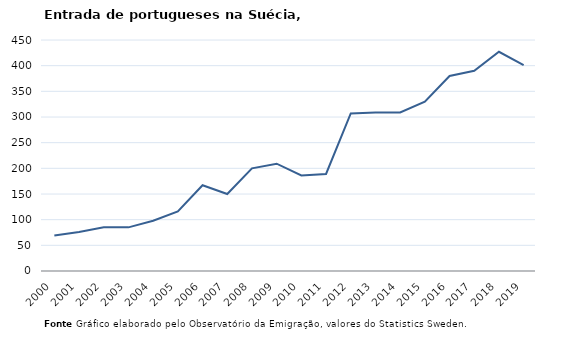
| Category | Entradas |
|---|---|
| 2000.0 | 69 |
| 2001.0 | 76 |
| 2002.0 | 85 |
| 2003.0 | 85 |
| 2004.0 | 98 |
| 2005.0 | 116 |
| 2006.0 | 167 |
| 2007.0 | 150 |
| 2008.0 | 200 |
| 2009.0 | 209 |
| 2010.0 | 186 |
| 2011.0 | 189 |
| 2012.0 | 307 |
| 2013.0 | 309 |
| 2014.0 | 309 |
| 2015.0 | 330 |
| 2016.0 | 380 |
| 2017.0 | 390 |
| 2018.0 | 427 |
| 2019.0 | 401 |